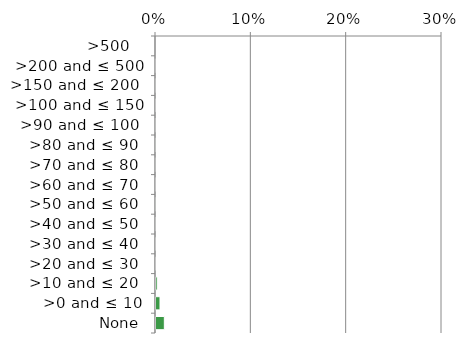
| Category | Near native & fragments |
|---|---|
|  None | 0.01 |
| >0 and ≤ 10 | 0.005 |
| >10 and ≤ 20  | 0.002 |
| >20 and ≤ 30  | 0.001 |
| >30 and ≤ 40  | 0.001 |
| >40 and ≤ 50  | 0 |
| >50 and ≤ 60  | 0 |
| >60 and ≤ 70  | 0 |
| >70 and ≤ 80  | 0 |
| >80 and ≤ 90  | 0 |
| >90 and ≤ 100  | 0 |
| >100 and ≤ 150 | 0.001 |
| >150 and ≤ 200  | 0 |
| >200 and ≤ 500 | 0 |
| >500   | 0 |